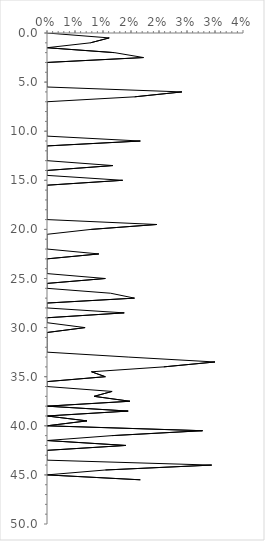
| Category | Series 0 |
|---|---|
| 0.0 | 0 |
| 0.011111111111111112 | 0.5 |
| 0.007751937984496124 | 1 |
| 0.0 | 1.5 |
| 0.012048192771084338 | 2 |
| 0.017241379310344827 | 2.5 |
| 0.0 | 3 |
| 0.0 | 3.5 |
| 0.0 | 4 |
| 0.0 | 4.5 |
| 0.0 | 5 |
| 0.0 | 5.5 |
| 0.024096385542168676 | 6 |
| 0.015625 | 6.5 |
| 0.0 | 7 |
| 0.0 | 7.5 |
| 0.0 | 8 |
| 0.0 | 8.5 |
| 0.0 | 9 |
| 0.0 | 9.5 |
| 0.0 | 10 |
| 0.0 | 10.5 |
| 0.016666666666666666 | 11 |
| 0.0 | 11.5 |
| 0.0 | 12 |
| 0.0 | 12.5 |
| 0.0 | 13 |
| 0.011764705882352941 | 13.5 |
| 0.0 | 14 |
| 0.0 | 14.5 |
| 0.013513513513513514 | 15 |
| 0.0 | 15.5 |
| 0.0 | 16 |
| 0.0 | 16.5 |
| 0.0 | 17 |
| 0.0 | 17.5 |
| 0.0 | 18 |
| 0.0 | 18.5 |
| 0.0 | 19 |
| 0.0196078431372549 | 19.5 |
| 0.007874015748031496 | 20 |
| 0.0 | 20.5 |
| 0.0 | 21 |
| 0.0 | 21.5 |
| 0.0 | 22 |
| 0.009259259259259259 | 22.5 |
| 0.0 | 23 |
| 0.0 | 23.5 |
| 0.0 | 24 |
| 0.0 | 24.5 |
| 0.010416666666666666 | 25 |
| 0.0 | 25.5 |
| 0.0 | 26 |
| 0.011363636363636364 | 26.5 |
| 0.015625 | 27 |
| 0.0 | 27.5 |
| 0.0 | 28 |
| 0.013793103448275862 | 28.5 |
| 0.0 | 29 |
| 0.0 | 29.5 |
| 0.006802721088435374 | 30 |
| 0.0 | 30.5 |
| 0.0 | 31 |
| 0.0 | 31.5 |
| 0.0 | 32 |
| 0.0 | 32.5 |
| 0.014492753623188406 | 33 |
| 0.03 | 33.5 |
| 0.020833333333333332 | 34 |
| 0.007936507936507936 | 34.5 |
| 0.010416666666666666 | 35 |
| 0.0 | 35.5 |
| 0.0 | 36 |
| 0.011627906976744186 | 36.5 |
| 0.008403361344537815 | 37 |
| 0.014814814814814815 | 37.5 |
| 0.0 | 38 |
| 0.014492753623188406 | 38.5 |
| 0.0 | 39 |
| 0.007142857142857143 | 39.5 |
| 0.0 | 40 |
| 0.027777777777777776 | 40.5 |
| 0.011627906976744186 | 41 |
| 0.0 | 41.5 |
| 0.014084507042253521 | 42 |
| 0.0 | 42.5 |
| 0.0 | 43 |
| 0.0 | 43.5 |
| 0.029411764705882353 | 44 |
| 0.010416666666666666 | 44.5 |
| 0.0 | 45 |
| 0.016666666666666666 | 45.5 |